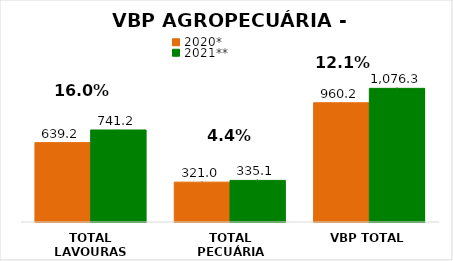
| Category | 2020* | 2021** |
|---|---|---|
| TOTAL LAVOURAS | 639.163 | 741.202 |
| TOTAL PECUÁRIA | 321.022 | 335.14 |
| VBP TOTAL | 960.185 | 1076.343 |